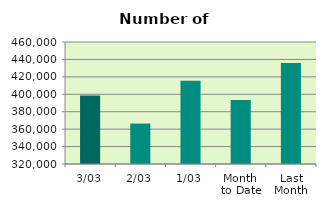
| Category | Series 0 |
|---|---|
| 3/03 | 398472 |
| 2/03 | 366380 |
| 1/03 | 415482 |
| Month 
to Date | 393444.667 |
| Last
Month | 435925.8 |